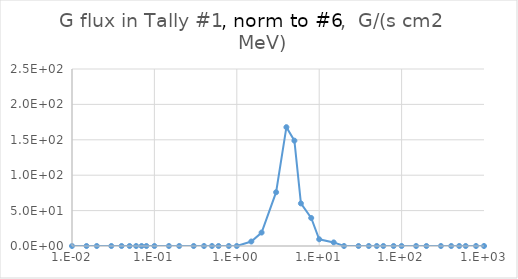
| Category | Series 0 |
|---|---|
| 1e-09 | 0 |
| 1e-08 | 0 |
| 2.5e-08 | 0 |
| 1e-07 | 0 |
| 2e-07 | 0 |
| 5e-07 | 0 |
| 1e-06 | 0 |
| 2e-06 | 0 |
| 5e-06 | 0 |
| 1e-05 | 0 |
| 2e-05 | 0 |
| 5e-05 | 0 |
| 0.0001 | 0 |
| 0.0002 | 0 |
| 0.0005 | 0 |
| 0.001 | 0 |
| 0.002 | 0 |
| 0.005 | 0 |
| 0.01 | 0 |
| 0.02 | 0 |
| 0.03 | 0 |
| 0.05 | 0 |
| 0.07 | 0 |
| 0.1 | 0 |
| 0.15 | 0 |
| 0.2 | 0 |
| 0.3 | 0 |
| 0.5 | 0 |
| 0.7 | 0 |
| 0.9 | 0 |
| 1.0 | 0 |
| 1.2 | 0 |
| 2.0 | 0 |
| 3.0 | 0 |
| 4.0 | 0 |
| 5.0 | 0 |
| 6.0 | 0 |
| 7.0 | 0 |
| 8.0 | 0 |
| 9.0 | 0 |
| 10.0 | 0 |
| 12.0 | 0 |
| 14.0 | 0 |
| 15.0 | 0 |
| 16.0 | 0 |
| 18.0 | 0 |
| 20.0 | 0 |
| 30.0 | 0 |
| 50.0 | 0 |
| 75.0 | 0 |
| 100.0 | 0 |
| 130.0 | 0 |
| 150.0 | 33.459 |
| 180.0 | 33.459 |
| 220.0 | 33.459 |
| 500.0 | 200.753 |
| 1000.0 | 133.835 |
| 2000.0 | 0 |
| 5000.0 | 0 |
| 8000.0 | 33.459 |